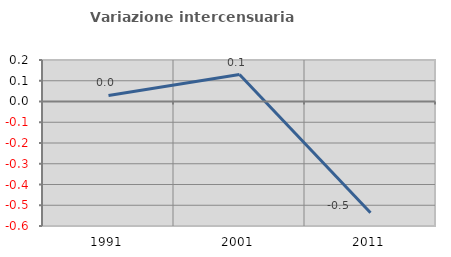
| Category | Variazione intercensuaria annua |
|---|---|
| 1991.0 | 0.029 |
| 2001.0 | 0.13 |
| 2011.0 | -0.536 |